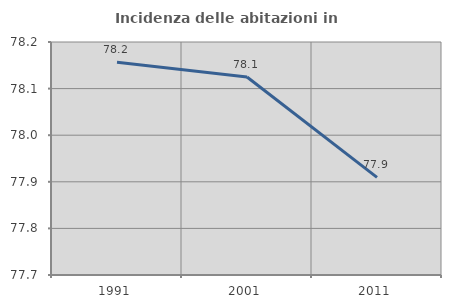
| Category | Incidenza delle abitazioni in proprietà  |
|---|---|
| 1991.0 | 78.157 |
| 2001.0 | 78.125 |
| 2011.0 | 77.909 |